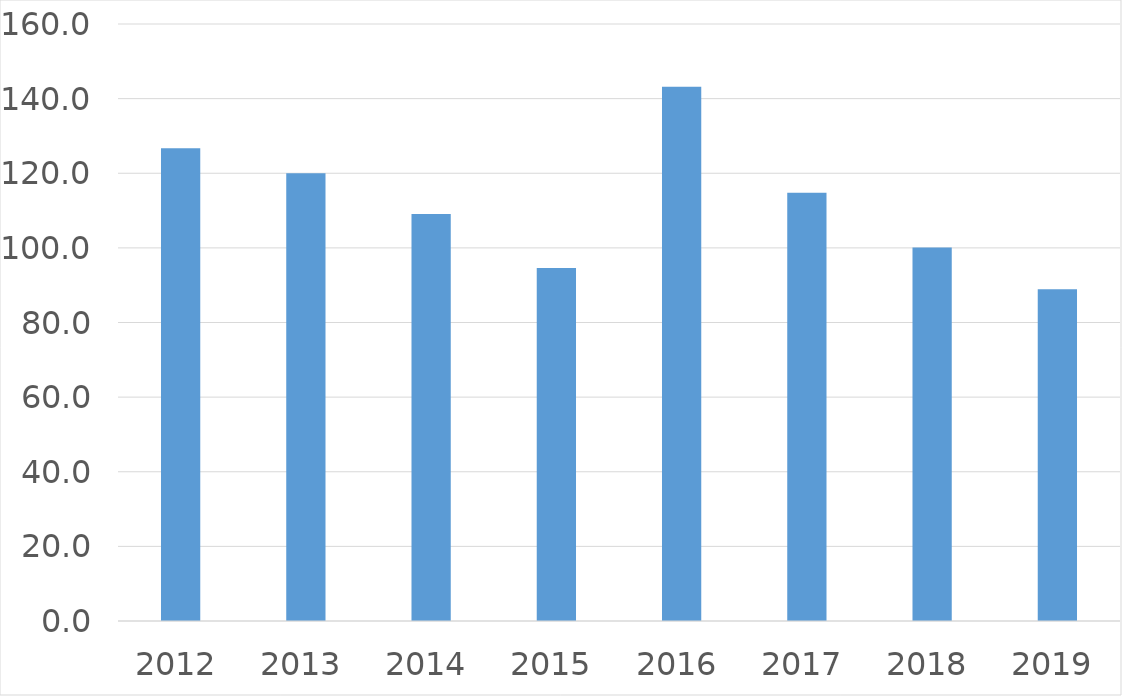
| Category | Series 0 |
|---|---|
| 2012 | 126.7 |
| 2013 | 120 |
| 2014 | 109.1 |
| 2015 | 94.6 |
| 2016 | 143.2 |
| 2017 | 114.8 |
| 2018 | 100.1 |
| 2019 | 88.9 |